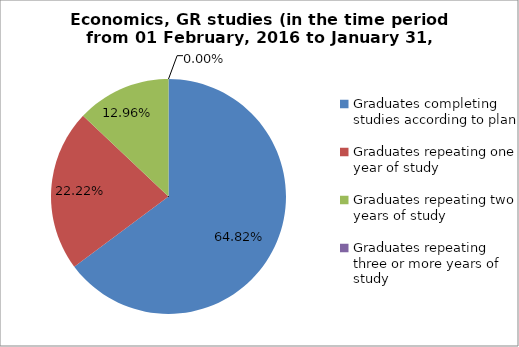
| Category | Series 0 |
|---|---|
| Graduates completing studies according to plan | 64.815 |
| Graduates repeating one year of study | 22.222 |
| Graduates repeating two years of study | 12.963 |
| Graduates repeating three or more years of study | 0 |